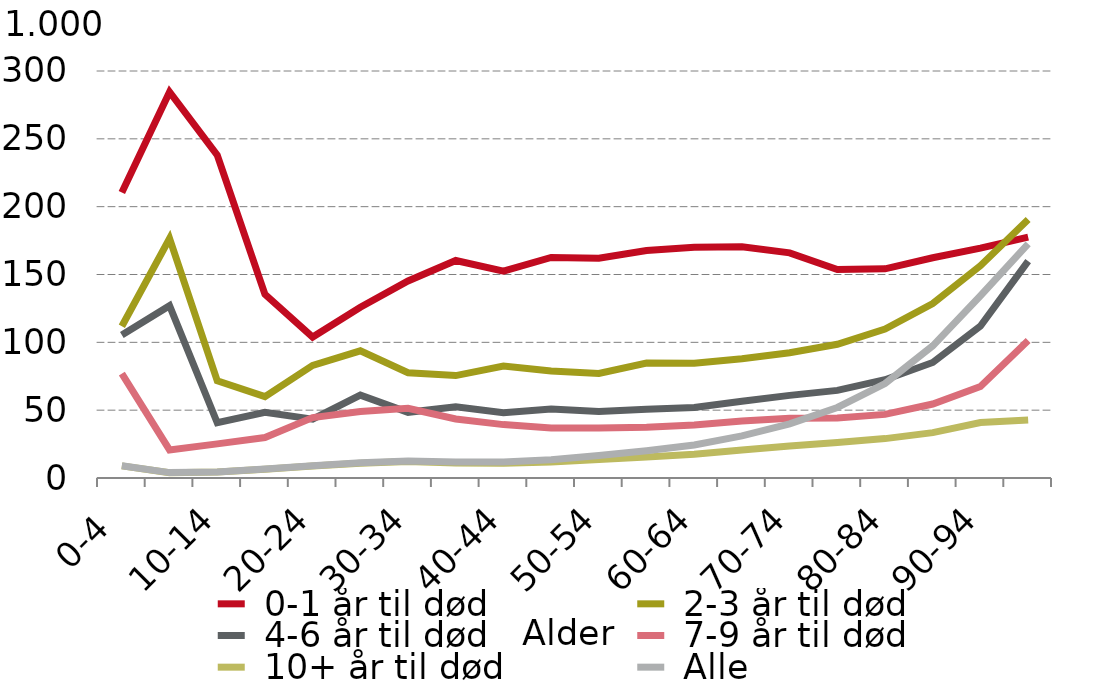
| Category |  0-1 år til død |  2-3 år til død |  4-6 år til død |  7-9 år til død |  10+ år til død |  Alle |
|---|---|---|---|---|---|---|
| 0-4 | 210.519 | 111.86 | 105.344 | 76.894 | 8.936 | 9.062 |
| 5-9 | 284.537 | 176.567 | 126.953 | 20.713 | 3.867 | 3.965 |
| 10-14 | 237.992 | 71.641 | 40.712 | 25.159 | 4.422 | 4.513 |
| 15-19 | 135.39 | 59.963 | 48.37 | 29.826 | 6.481 | 6.651 |
| 20-24 | 103.876 | 82.981 | 43.356 | 44.547 | 8.808 | 9.024 |
| 25-29 | 125.818 | 93.73 | 61.093 | 48.986 | 10.957 | 11.268 |
| 30-34 | 145.205 | 77.616 | 48.413 | 51.341 | 12.103 | 12.512 |
| 35-39 | 160.317 | 75.478 | 52.493 | 43.471 | 11.145 | 11.788 |
| 40-44 | 152.536 | 82.52 | 48.135 | 39.358 | 10.783 | 11.854 |
| 45-49 | 162.531 | 78.886 | 50.832 | 36.945 | 11.7 | 13.522 |
| 50-54 | 162.061 | 77.096 | 48.982 | 36.767 | 13.647 | 16.65 |
| 55-59 | 167.714 | 84.764 | 50.62 | 37.386 | 15.468 | 20.133 |
| 60-64 | 170.168 | 84.522 | 51.929 | 39.055 | 17.453 | 24.344 |
| 65-69 | 170.404 | 87.877 | 56.621 | 42.071 | 20.634 | 30.996 |
| 70-74 | 165.948 | 92.283 | 60.909 | 43.955 | 23.507 | 39.968 |
| 75-79 | 153.654 | 98.549 | 64.58 | 44.307 | 26.211 | 51.977 |
| 80-84 | 154.198 | 109.838 | 72.415 | 46.897 | 29.036 | 69.613 |
| 85-89 | 162.37 | 128.569 | 85.13 | 54.531 | 33.446 | 97.442 |
| 90-94 | 169.456 | 156.497 | 111.958 | 67.435 | 40.921 | 134.343 |
| 95-99 | 177.491 | 190.476 | 159.826 | 101.409 | 42.731 | 172.549 |